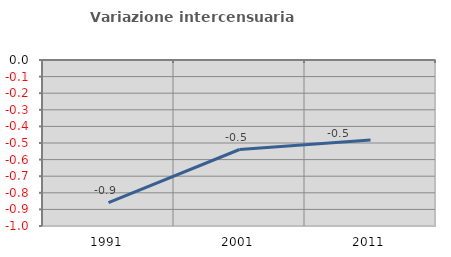
| Category | Variazione intercensuaria annua |
|---|---|
| 1991.0 | -0.859 |
| 2001.0 | -0.539 |
| 2011.0 | -0.483 |